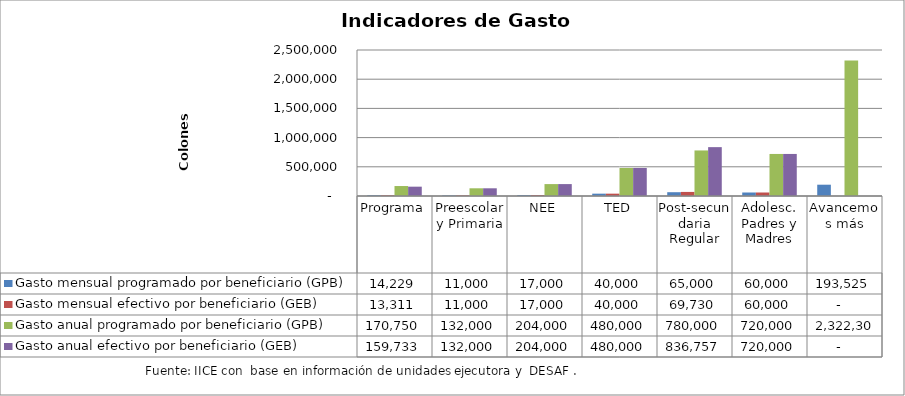
| Category | Gasto mensual programado por beneficiario (GPB)  | Gasto mensual efectivo por beneficiario (GEB)  | Gasto anual programado por beneficiario (GPB)  | Gasto anual efectivo por beneficiario (GEB)  |
|---|---|---|---|---|
| Programa | 14229.203 | 13311.084 | 170750.433 | 159733.013 |
| Preescolar y Primaria | 11000 | 11000 | 132000 | 132000 |
| NEE | 17000 | 17000 | 204000 | 204000 |
| TED | 40000 | 40000 | 480000 | 480000 |
| Post-secundaria Regular | 65000 | 69729.782 | 780000 | 836757.388 |
| Adolesc. Padres y Madres | 60000 | 60000 | 720000 | 720000 |
| Avancemos más | 193525.253 | 0 | 2322303.03 | 0 |